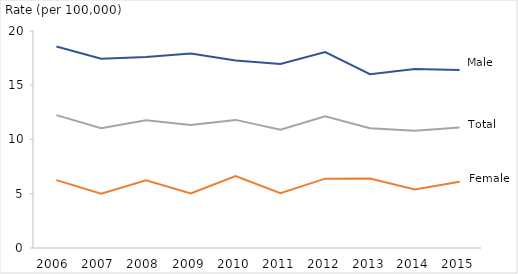
| Category | Male | Female | Total |
|---|---|---|---|
| 2006  | 18.572 | 6.252 | 12.249 |
| 2007  | 17.446 | 5.006 | 11.044 |
| 2008  | 17.609 | 6.244 | 11.77 |
| 2009 | 17.932 | 5.03 | 11.329 |
| 2010 | 17.273 | 6.634 | 11.807 |
| 2011 | 16.952 | 5.056 | 10.9 |
| 2012 | 18.062 | 6.391 | 12.131 |
| 2013 | 16.024 | 6.412 | 11.044 |
| 2014 | 16.5 | 5.4 | 10.8 |
| 2015 | 16.4 | 6.1 | 11.1 |